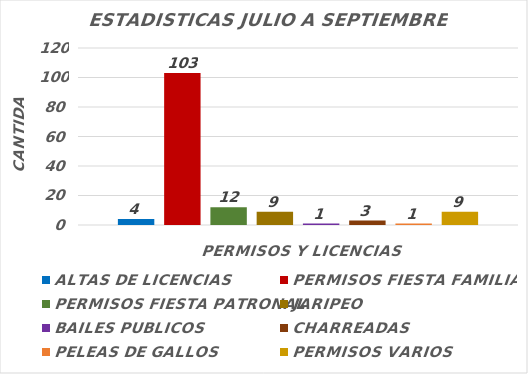
| Category | ALTAS DE LICENCIAS | PERMISOS FIESTA FAMILIAR | PERMISOS FIESTA PATRONAL | JARIPEO | BAILES PUBLICOS | CHARREADAS | PELEAS DE GALLOS | PERMISOS VARIOS |
|---|---|---|---|---|---|---|---|---|
| 0 | 4 | 103 | 12 | 9 | 1 | 3 | 1 | 9 |